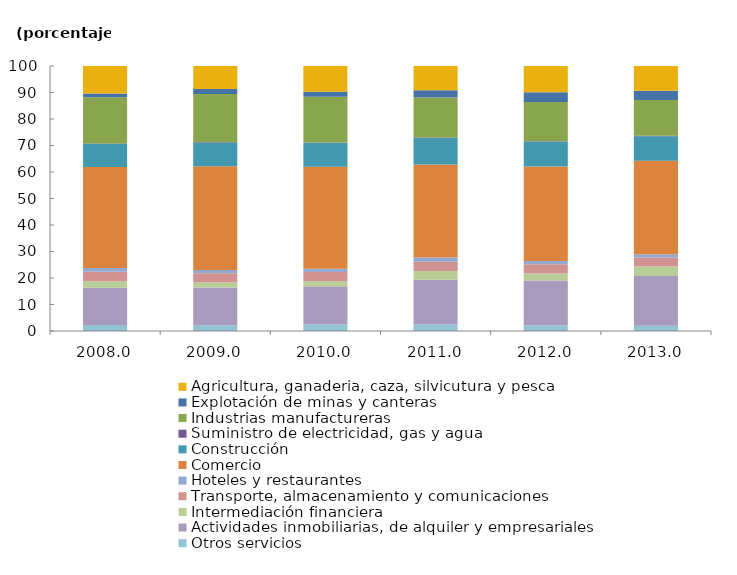
| Category | Otros servicios | Actividades inmobiliarias, de alquiler y empresariales | Intermediación financiera  | Transporte, almacenamiento y comunicaciones | Hoteles y restaurantes | Comercio | Construcción  | Suministro de electricidad, gas y agua | Industrias manufactureras | Explotación de minas y canteras | Agricultura, ganaderia, caza, silvicutura y pesca |
|---|---|---|---|---|---|---|---|---|---|---|---|
| 2008.0 | 2.228 | 14.064 | 2.491 | 3.614 | 1.33 | 38.184 | 8.689 | 0.15 | 17.472 | 1.404 | 10.375 |
| 2009.0 | 2.213 | 14.194 | 1.901 | 3.475 | 1.213 | 39.158 | 8.949 | 0.197 | 18.177 | 1.803 | 8.72 |
| 2010.0 | 2.444 | 14.4 | 1.921 | 3.47 | 1.268 | 38.5 | 8.991 | 0.131 | 17.31 | 1.865 | 9.7 |
| 2011.0 | 2.442 | 16.906 | 3.256 | 3.559 | 1.59 | 35.081 | 9.958 | 0.265 | 15.051 | 2.707 | 9.182 |
| 2012.0 | 2.166 | 16.854 | 2.712 | 3.497 | 1.211 | 35.67 | 9.297 | 0.222 | 14.79 | 3.651 | 9.928 |
| 2013.0 | 1.994 | 18.729 | 3.634 | 3.336 | 1.305 | 35.278 | 9.206 | 0.205 | 13.511 | 3.429 | 9.374 |